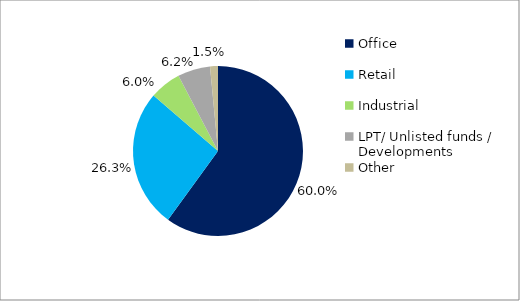
| Category | Series 0 |
|---|---|
| Office | 0.6 |
| Retail  | 0.263 |
| Industrial  | 0.06 |
| LPT/ Unlisted funds / Developments | 0.062 |
| Other | 0.015 |